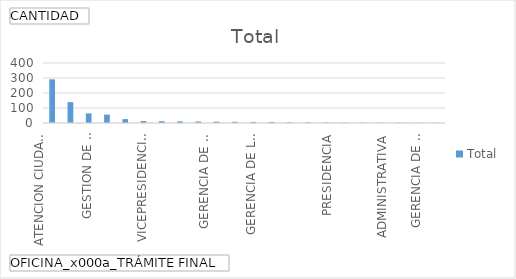
| Category | Total |
|---|---|
| ATENCION CIUDADANA Y COMUNICACIONES | 291 |
| GERENCIA DE SEGURIDAD, COMUNIDADES Y MEDIO AMBIENTE | 139 |
| GESTION DE REGALIAS Y DERECHOS ECONOMICOS | 64 |
| GERENCIA DE RESERVAS Y OPERACIONES | 56 |
| OFICINA ASESORA JURIDICA | 26 |
| VICEPRESIDENCIA PROMOCION Y ASIGNACION DE AREAS | 13 |
| TALENTO HUMANO | 12 |
| GERENCIA DE SEGUIMIENTO A CONTRATOS EN EXPLORACION | 11 |
| GERENCIA DE GESTION DEL CONOCIMIENTO | 10 |
| GERENCIA DE ASUNTOS LEGALES Y CONTRATACION | 9 |
| OFICINA DE CONTROL INTERNO | 8 |
| GERENCIA DE LA GESTION DE LA INFORMACION TECNICA | 7 |
| VICEPRESIDENCIA DE OPERACIONES, REGALIAS Y PARTICIPACIONES | 7 |
| PRESIDENCIA | 4 |
| FINANCIERA | 4 |
| GERENCIA DE PLANEACION | 3 |
| ADMINISTRATIVA | 2 |
| VICEPRESIDENCIA TECNICA | 2 |
| CONTROL INTERNO DISCIPLINARIO | 2 |
| GERENCIA DE SEGUIMIENTO A CONTRATOS EN PRODUCCION | 2 |
| VICEPRESIDENCIA ADMINISTRATIVA Y FINANCIERA | 1 |
| VICEPRESIDENCIA CONTRATOS DE HIDROCARBUROS | 1 |